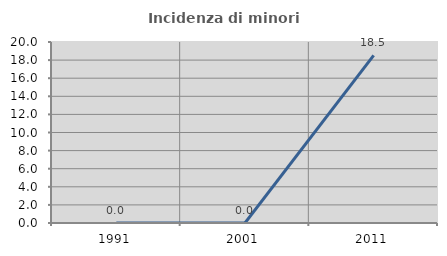
| Category | Incidenza di minori stranieri |
|---|---|
| 1991.0 | 0 |
| 2001.0 | 0 |
| 2011.0 | 18.519 |